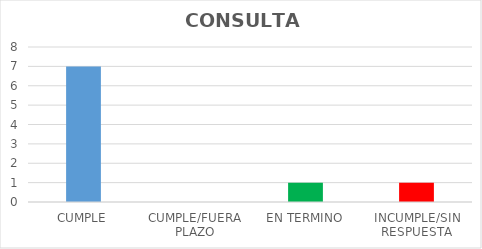
| Category | TOTAL |
|---|---|
| CUMPLE | 7 |
| CUMPLE/FUERA PLAZO | 0 |
| EN TERMINO | 1 |
| INCUMPLE/SIN RESPUESTA | 1 |